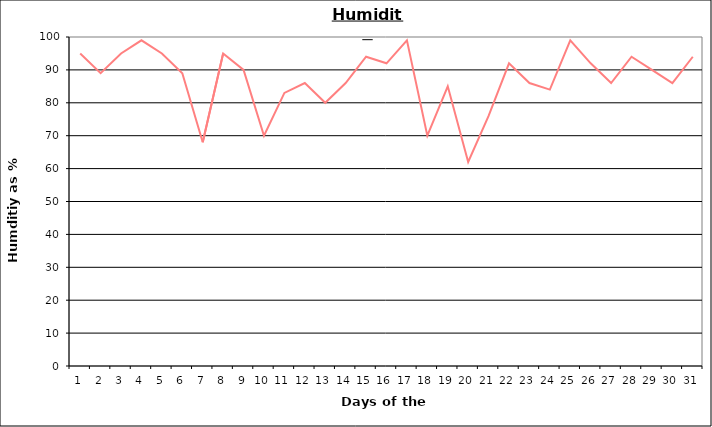
| Category | Series 0 |
|---|---|
| 0 | 95 |
| 1 | 89 |
| 2 | 95 |
| 3 | 99 |
| 4 | 95 |
| 5 | 89 |
| 6 | 68 |
| 7 | 95 |
| 8 | 90 |
| 9 | 70 |
| 10 | 83 |
| 11 | 86 |
| 12 | 80 |
| 13 | 86 |
| 14 | 94 |
| 15 | 92 |
| 16 | 99 |
| 17 | 70 |
| 18 | 85 |
| 19 | 62 |
| 20 | 76 |
| 21 | 92 |
| 22 | 86 |
| 23 | 84 |
| 24 | 99 |
| 25 | 92 |
| 26 | 86 |
| 27 | 94 |
| 28 | 90 |
| 29 | 86 |
| 30 | 94 |